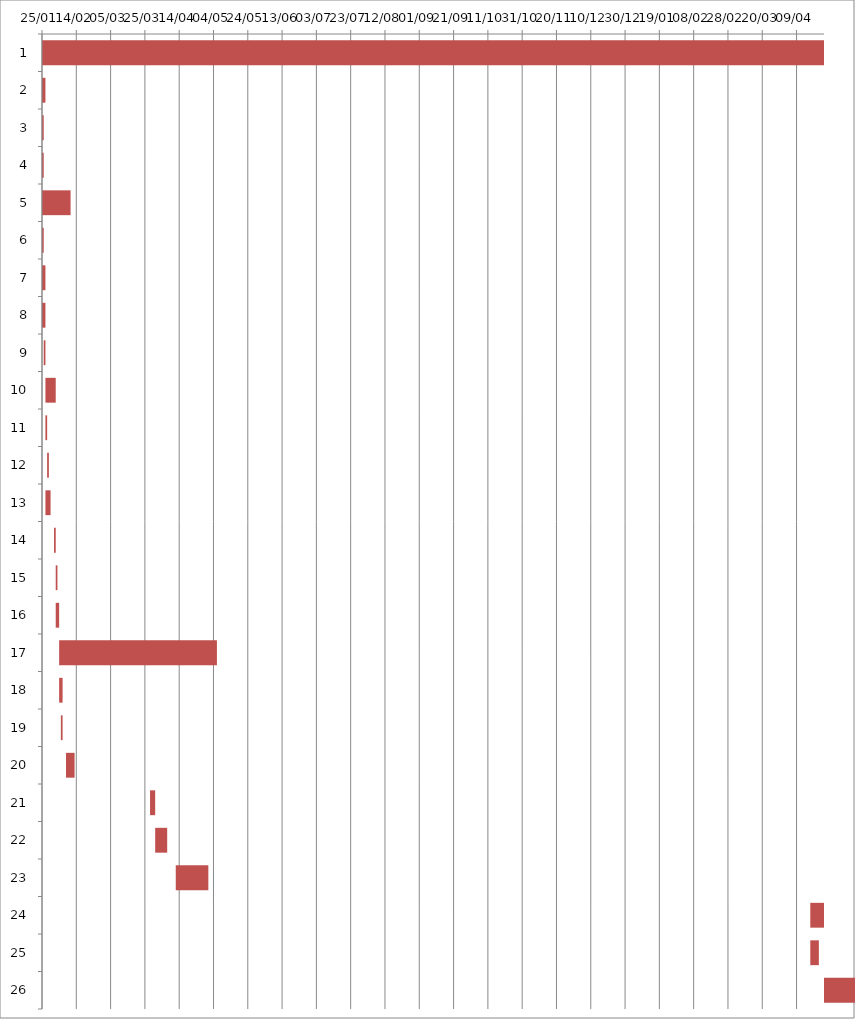
| Category | Fecha de inicio | DURACIÓN |
|---|---|---|
| 0 | 1/25/16 | 613 |
| 1 | 1/25/16 | 2 |
| 2 | 1/25/16 | 1 |
| 3 | 1/25/16 | 1 |
| 4 | 1/25/16 | 16.667 |
| 5 | 1/25/16 | 1 |
| 6 | 1/25/16 | 2 |
| 7 | 1/25/16 | 2 |
| 8 | 1/26/16 | 1 |
| 9 | 1/27/16 | 6 |
| 10 | 1/27/16 | 1 |
| 11 | 1/28/16 | 1 |
| 12 | 1/27/16 | 3 |
| 13 | 2/1/16 | 1 |
| 14 | 2/2/16 | 1 |
| 15 | 2/2/16 | 2 |
| 16 | 2/4/16 | 92 |
| 17 | 2/4/16 | 2 |
| 18 | 2/5/16 | 1 |
| 19 | 2/8/16 | 5 |
| 20 | 3/28/16 | 3 |
| 21 | 3/31/16 | 7 |
| 22 | 4/12/16 | 19 |
| 23 | 4/17/17 | 165 |
| 24 | 4/17/17 | 5 |
| 25 | 7/3/17 | 145 |